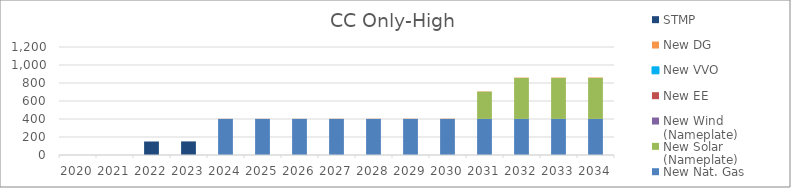
| Category | New Nat. Gas | New Solar (Nameplate) | New Wind (Nameplate) | New EE | New VVO | New DG | STMP |
|---|---|---|---|---|---|---|---|
| 2020.0 | 0 | 0 | 0 | 0 | 0 | 0 | 0 |
| 2021.0 | 0 | 0 | 0 | 0 | 0 | 0 | 0 |
| 2022.0 | 0 | 0 | 0 | 0 | 0 | 0 | 150 |
| 2023.0 | 0 | 0 | 0 | 0 | 0 | 1.022 | 150 |
| 2024.0 | 401 | 0 | 0 | 0 | 0 | 1.533 | 0 |
| 2025.0 | 401 | 0 | 0 | 0 | 0 | 1.533 | 0 |
| 2026.0 | 401 | 0 | 0 | 0 | 0 | 1.533 | 0 |
| 2027.0 | 401 | 0 | 0 | 0 | 0 | 2.044 | 0 |
| 2028.0 | 401 | 0 | 0 | 0 | 0 | 2.044 | 0 |
| 2029.0 | 401 | 0 | 0 | 0 | 0 | 2.555 | 0 |
| 2030.0 | 401 | 0 | 0 | 0 | 0 | 3.066 | 0 |
| 2031.0 | 401 | 303.593 | 0 | 0 | 0 | 3.577 | 0 |
| 2032.0 | 401 | 455.389 | 0 | 0 | 0 | 3.577 | 0 |
| 2033.0 | 401 | 455.389 | 0 | 0 | 0 | 4.088 | 0 |
| 2034.0 | 401 | 455.389 | 0 | 0 | 0 | 4.599 | 0 |